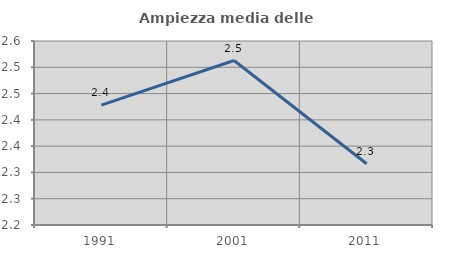
| Category | Ampiezza media delle famiglie |
|---|---|
| 1991.0 | 2.428 |
| 2001.0 | 2.513 |
| 2011.0 | 2.317 |